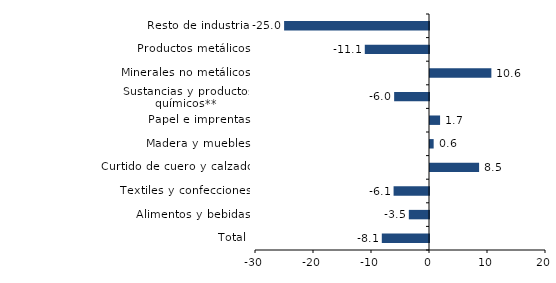
| Category | Series 0 |
|---|---|
| Total | -8.138 |
| Alimentos y bebidas | -3.478 |
| Textiles y confecciones | -6.107 |
| Curtido de cuero y calzado | 8.464 |
| Madera y muebles | 0.631 |
| Papel e imprentas | 1.736 |
| Sustancias y productos químicos** | -6.01 |
| Minerales no metálicos | 10.58 |
| Productos metálicos | -11.07 |
| Resto de industria | -24.981 |